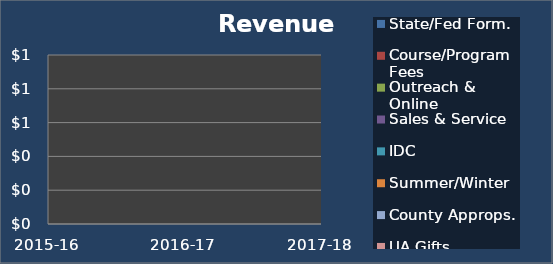
| Category | Other | Unit Head Allocated | UAFoundation | UA Gifts | County Approps. | Summer/Winter  | IDC | Sales & Service | Outreach & Online | Course/Program Fees | State/Fed Form. |
|---|---|---|---|---|---|---|---|---|---|---|---|
| 2015-16 | 0 | 0 | 0 | 0 | 0 | 0 | 0 | 0 | 0 | 0 | 0 |
| 2016-17 | 0 | 0 | 0 | 0 | 0 | 0 | 0 | 0 | 0 | 0 | 0 |
| 2017-18 | 0 | 0 | 0 | 0 | 0 | 0 | 0 | 0 | 0 | 0 | 0 |